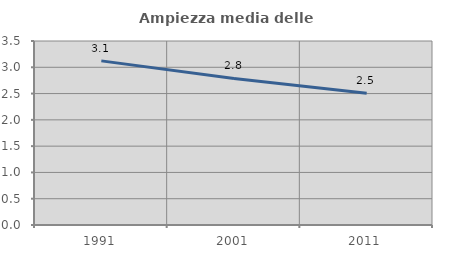
| Category | Ampiezza media delle famiglie |
|---|---|
| 1991.0 | 3.122 |
| 2001.0 | 2.787 |
| 2011.0 | 2.504 |